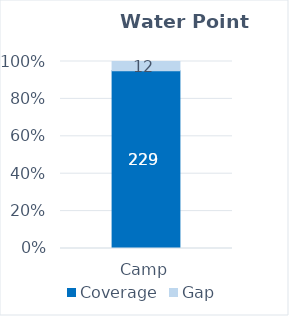
| Category | Coverage | Gap |
|---|---|---|
| Camp | 228.603 | 11.963 |